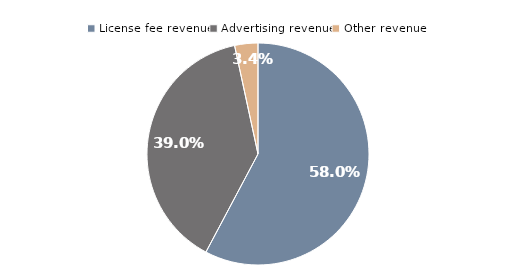
| Category | Series 0 |
|---|---|
| License fee revenue | 58 |
| Advertising revenue | 39 |
| Other revenue | 3.4 |